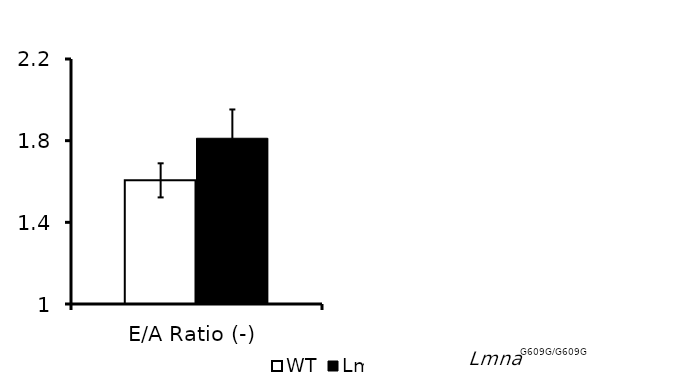
| Category | WT | Lmna |
|---|---|---|
| 0 | 1.606 | 1.812 |